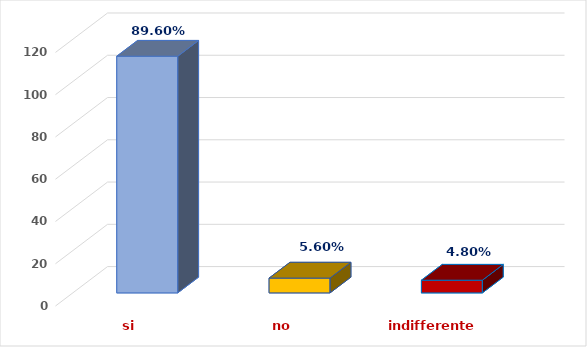
| Category | Series 0 |
|---|---|
| si | 112 |
| no | 7 |
| indifferente | 6 |